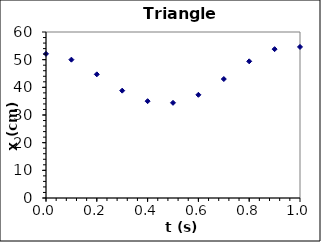
| Category | x (cm) |
|---|---|
| 0.0 | 52.1 |
| 0.1 | 50 |
| 0.2 | 44.7 |
| 0.3 | 38.8 |
| 0.4 | 35 |
| 0.5 | 34.4 |
| 0.6 | 37.3 |
| 0.7 | 43 |
| 0.8 | 49.4 |
| 0.9 | 53.8 |
| 1.0 | 54.6 |